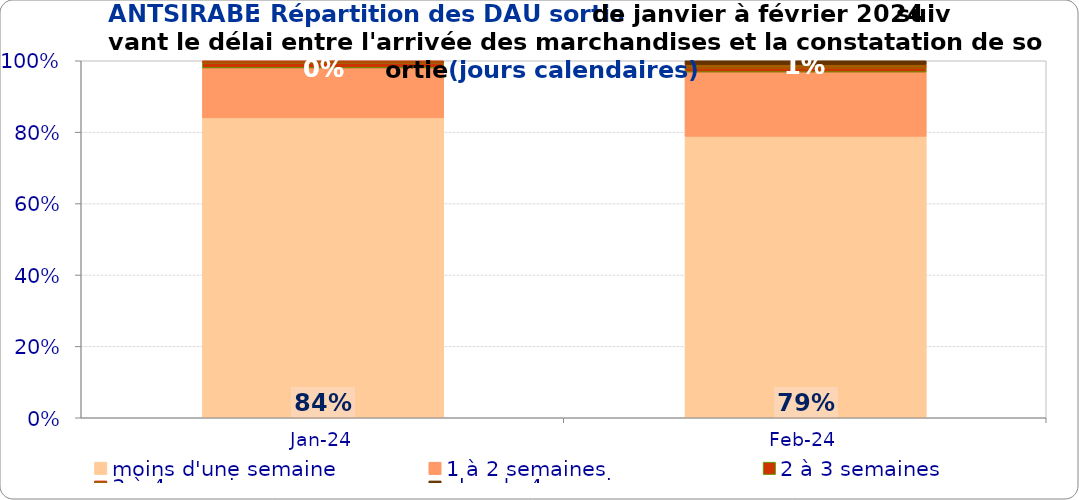
| Category | moins d'une semaine | 1 à 2 semaines | 2 à 3 semaines | 3 à 4 semaines | plus de 4 semaines |
|---|---|---|---|---|---|
| 2024-01-01 | 0.84 | 0.14 | 0.013 | 0.007 | 0 |
| 2024-02-01 | 0.788 | 0.18 | 0.011 | 0.011 | 0.011 |